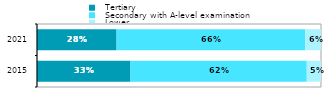
| Category |   Tertiary |   Secondary with A-level examination |   Lower |
|---|---|---|---|
| 2015.0 | 0.329 | 0.621 | 0.05 |
| 2021.0 | 0.28 | 0.664 | 0.056 |